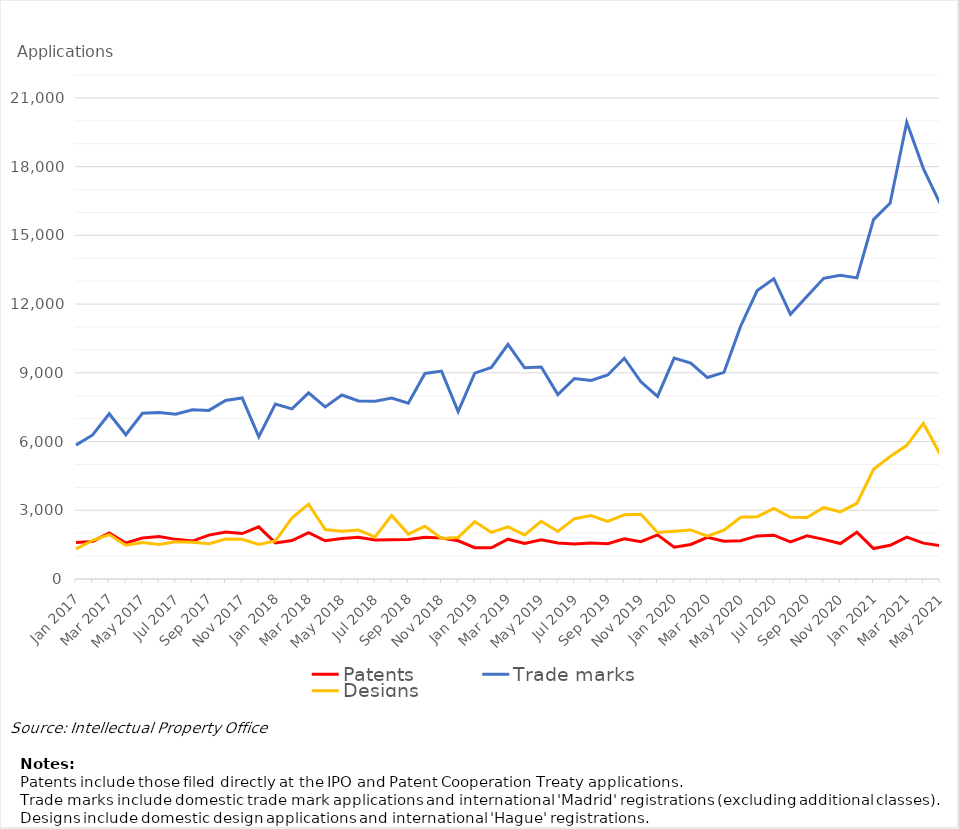
| Category | Patents | Trade marks | Designs |
|---|---|---|---|
| Jan 2017 | 1596 | 5843 | 1318 |
| Feb 2017 | 1640 | 6288 | 1687 |
| Mar 2017 | 2011 | 7214 | 1940 |
| Apr 2017 | 1573 | 6297 | 1474 |
| May 2017 | 1790 | 7234 | 1592 |
| Jun 2017 | 1853 | 7263 | 1502 |
| Jul 2017 | 1730 | 7197 | 1627 |
| Aug 2017 | 1657 | 7389 | 1600 |
| Sep 2017 | 1915 | 7359 | 1544 |
| Oct 2017 | 2055 | 7792 | 1745 |
| Nov 2017 | 1983 | 7901 | 1736 |
| Dec 2017 | 2277 | 6211 | 1507 |
| Jan 2018 | 1575 | 7634 | 1658 |
| Feb 2018 | 1676 | 7428 | 2672 |
| Mar 2018 | 2022 | 8127 | 3267 |
| Apr 2018 | 1670 | 7512 | 2160 |
| May 2018 | 1767 | 8030 | 2083 |
| Jun 2018 | 1821 | 7769 | 2136 |
| Jul 2018 | 1704 | 7757 | 1832 |
| Aug 2018 | 1713 | 7897 | 2777 |
| Sep 2018 | 1725 | 7673 | 1960 |
| Oct 2018 | 1818 | 8972 | 2302 |
| Nov 2018 | 1787 | 9076 | 1765 |
| Dec 2018 | 1670 | 7304 | 1815 |
| Jan 2019 | 1367 | 8984 | 2505 |
| Feb 2019 | 1361 | 9234 | 2031 |
| Mar 2019 | 1737 | 10243 | 2274 |
| Apr 2019 | 1552 | 9219 | 1923 |
| May 2019 | 1710 | 9251 | 2520 |
| Jun 2019 | 1569 | 8053 | 2074 |
| Jul 2019 | 1527 | 8752 | 2634 |
| Aug 2019 | 1571 | 8670 | 2768 |
| Sep 2019 | 1540 | 8907 | 2511 |
| Oct 2019 | 1755 | 9636 | 2800 |
| Nov 2019 | 1630 | 8607 | 2827 |
| Dec 2019 | 1926 | 7970 | 2028 |
| Jan 2020 | 1392 | 9642 | 2082 |
| Feb 2020 | 1506 | 9428 | 2143 |
| Mar 2020 | 1819 | 8794 | 1871 |
| Apr 2020 | 1648 | 9021 | 2127 |
| May 2020 | 1671 | 11035 | 2694 |
| Jun 2020 | 1880 | 12593 | 2721 |
| Jul 2020 | 1911 | 13110 | 3085 |
| Aug 2020 | 1616 | 11551 | 2694 |
| Sep 2020 | 1886 | 12340 | 2686 |
| Oct 2020 | 1731 | 13126 | 3124 |
| Nov 2020 | 1548 | 13254 | 2930 |
| Dec 2020 | 2043 | 13143 | 3303 |
| Jan 2021 | 1330 | 15686 | 4792 |
| Feb 2021 | 1472 | 16412 | 5347 |
| Mar 2021 | 1831 | 19936 | 5836 |
| Apr 2021 | 1565 | 17914 | 6794 |
| May 2021 | 1455 | 16398 | 5458 |